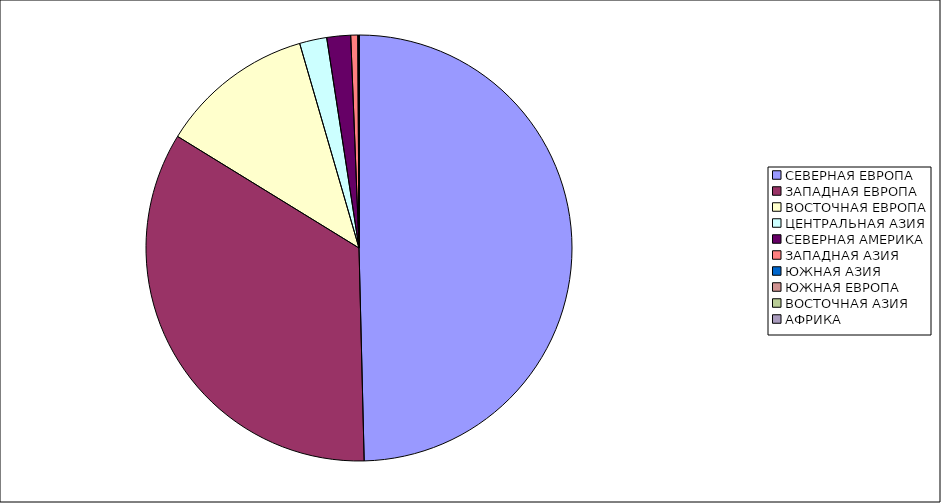
| Category | Оборот |
|---|---|
| СЕВЕРНАЯ ЕВРОПА | 49.612 |
| ЗАПАДНАЯ ЕВРОПА | 34.163 |
| ВОСТОЧНАЯ ЕВРОПА | 11.732 |
| ЦЕНТРАЛЬНАЯ АЗИЯ | 2.065 |
| СЕВЕРНАЯ АМЕРИКА | 1.806 |
| ЗАПАДНАЯ АЗИЯ | 0.533 |
| ЮЖНАЯ АЗИЯ | 0.053 |
| ЮЖНАЯ ЕВРОПА | 0.03 |
| ВОСТОЧНАЯ АЗИЯ | 0.003 |
| АФРИКА | 0.002 |